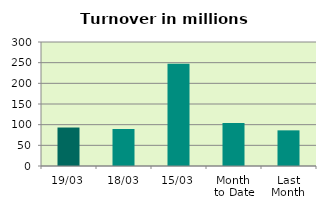
| Category | Series 0 |
|---|---|
| 19/03 | 93.102 |
| 18/03 | 89.588 |
| 15/03 | 247.413 |
| Month 
to Date | 103.919 |
| Last
Month | 86.247 |